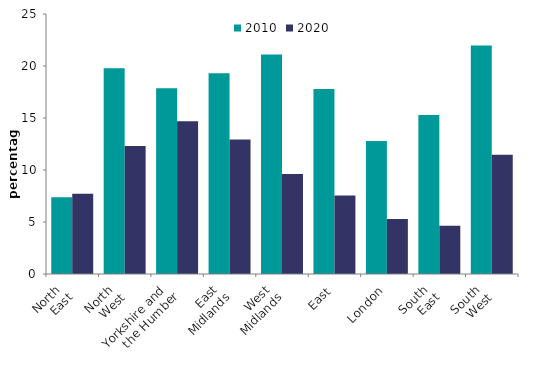
| Category | 2010 | 2020 |
|---|---|---|
| North 
East | 7.37 | 7.723 |
| North 
West | 19.773 | 12.296 |
| Yorkshire and 
the Humber | 17.862 | 14.694 |
| East 
Midlands | 19.31 | 12.923 |
| West 
Midlands | 21.101 | 9.606 |
| East | 17.794 | 7.536 |
| London | 12.785 | 5.294 |
| South 
East | 15.294 | 4.639 |
| South 
West | 21.96 | 11.46 |